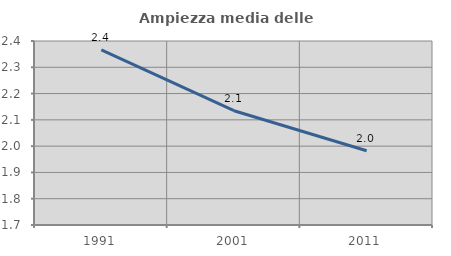
| Category | Ampiezza media delle famiglie |
|---|---|
| 1991.0 | 2.366 |
| 2001.0 | 2.135 |
| 2011.0 | 1.983 |